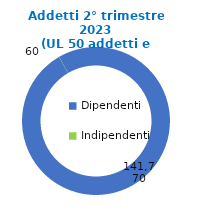
| Category | Series 0 |
|---|---|
| Dipendenti | 141770 |
| Indipendenti | 60 |